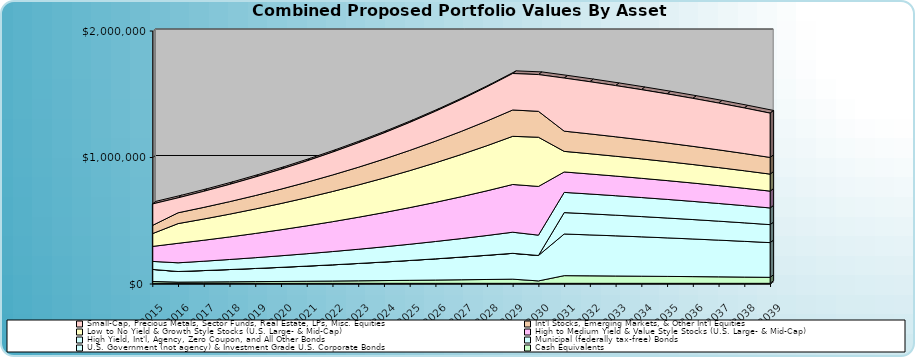
| Category | Cash Equivalents | U.S. Government (not agency) & Investment Grade U.S. Corporate Bonds | Municipal (federally tax-free) Bonds | High Yield, Int'l, Agency, Zero Coupon, and All Other Bonds | High to Medium Yield & Value Style Stocks (U.S. Large- & Mid-Cap) | Low to No Yield & Growth Style Stocks (U.S. Large- & Mid-Cap) | Int'l Stocks, Emerging Markets, & Other Int'l Equities | Small-Cap, Precious Metals, Sector Funds, Real Estate, LPs, Misc. Equities |
|---|---|---|---|---|---|---|---|---|
| 2015.0 | 22209.9 | 95903.6 | 0 | 63070 | 118349 | 100868.9 | 64819 | 169811.25 |
| 2016.0 | 17372.799 | 83932.115 | 0 | 68717.855 | 154301.62 | 155743.691 | 85546.194 | 118078.316 |
| 2017.0 | 18601.488 | 90258.037 | 0 | 73875.914 | 166016.741 | 167568.299 | 91993.768 | 127019.763 |
| 2018.0 | 19905.434 | 96971.421 | 0 | 79349.905 | 178449.413 | 180117.164 | 98836.256 | 136508.874 |
| 2019.0 | 21289.246 | 104096.001 | 0 | 85159.178 | 191643.586 | 193434.648 | 106097.847 | 146579.193 |
| 2020.0 | 22757.817 | 111656.961 | 0 | 91324.268 | 205645.902 | 207567.827 | 113804.21 | 157266.32 |
| 2021.0 | 24316.338 | 119681.03 | 0 | 97866.97 | 220505.861 | 222566.663 | 121982.588 | 168608.032 |
| 2022.0 | 25970.319 | 128196.573 | 0 | 104810.413 | 236275.991 | 238484.178 | 130661.891 | 180644.425 |
| 2023.0 | 27725.606 | 137233.693 | 0 | 112179.142 | 253012.043 | 255376.641 | 139872.802 | 193418.047 |
| 2024.0 | 29588.404 | 146824.337 | 0 | 119999.205 | 270773.177 | 273303.768 | 149647.881 | 206974.053 |
| 2025.0 | 31565.298 | 157002.407 | 0 | 128298.247 | 289622.181 | 292328.93 | 160021.684 | 221360.364 |
| 2026.0 | 33663.278 | 167803.885 | 0 | 137105.606 | 309625.686 | 312519.384 | 171030.882 | 236627.837 |
| 2027.0 | 35889.758 | 179266.953 | 0 | 146452.415 | 330854.406 | 333946.504 | 182714.394 | 252830.443 |
| 2028.0 | 38252.611 | 191432.133 | 0 | 156371.716 | 353383.385 | 356686.034 | 195113.521 | 270025.458 |
| 2029.0 | 40760.188 | 204342.432 | 0 | 166898.575 | 377292.265 | 380818.36 | 208272.094 | 288273.668 |
| 2030.0 | 26933.104 | 201065.485 | 0 | 160765.704 | 385197.813 | 388797.792 | 204932.129 | 290498.33 |
| 2031.0 | 68588.613 | 329303.594 | 169135.416 | 159868.178 | 161376.368 | 162884.559 | 159868.178 | 419524.969 |
| 2032.0 | 67192.769 | 323554.374 | 166316.087 | 156938.287 | 158418.837 | 159899.387 | 156938.287 | 412269.342 |
| 2033.0 | 65727.132 | 317517.693 | 163355.792 | 153861.901 | 155313.428 | 156764.956 | 153861.901 | 404650.934 |
| 2034.0 | 64188.214 | 311179.177 | 160247.481 | 150631.696 | 152052.75 | 153473.804 | 150631.696 | 396651.606 |
| 2035.0 | 62572.349 | 304523.736 | 156983.755 | 147239.981 | 148629.037 | 150018.094 | 147239.981 | 388252.311 |
| 2036.0 | 60875.692 | 297535.523 | 153556.843 | 143678.68 | 145034.139 | 146389.599 | 143678.68 | 379433.052 |
| 2037.0 | 59094.201 | 290197.899 | 149958.585 | 139939.314 | 141259.496 | 142579.678 | 139939.314 | 370172.83 |
| 2038.0 | 57223.637 | 282493.394 | 146180.414 | 136012.98 | 137296.121 | 138579.262 | 136012.98 | 360449.596 |
| 2039.0 | 55259.543 | 274403.664 | 142213.335 | 131890.329 | 133134.577 | 134378.825 | 131890.329 | 350240.201 |